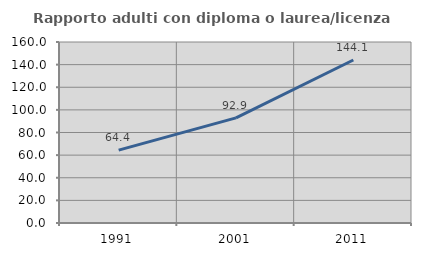
| Category | Rapporto adulti con diploma o laurea/licenza media  |
|---|---|
| 1991.0 | 64.444 |
| 2001.0 | 92.929 |
| 2011.0 | 144.086 |